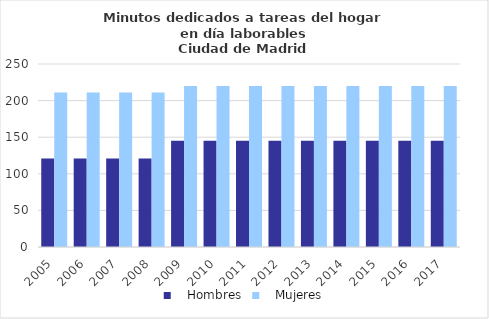
| Category |    Hombres |    Mujeres |
|---|---|---|
| 2005.0 | 121 | 211 |
| 2006.0 | 121 | 211 |
| 2007.0 | 121 | 211 |
| 2008.0 | 121 | 211 |
| 2009.0 | 145 | 220 |
| 2010.0 | 145 | 220 |
| 2011.0 | 145 | 220 |
| 2012.0 | 145 | 220 |
| 2013.0 | 145 | 220 |
| 2014.0 | 145 | 220 |
| 2015.0 | 145 | 220 |
| 2016.0 | 145 | 220 |
| 2017.0 | 145 | 220 |